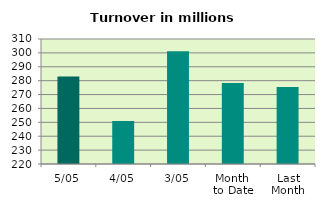
| Category | Series 0 |
|---|---|
| 5/05 | 283.057 |
| 4/05 | 250.987 |
| 3/05 | 301.145 |
| Month 
to Date | 278.396 |
| Last
Month | 275.481 |